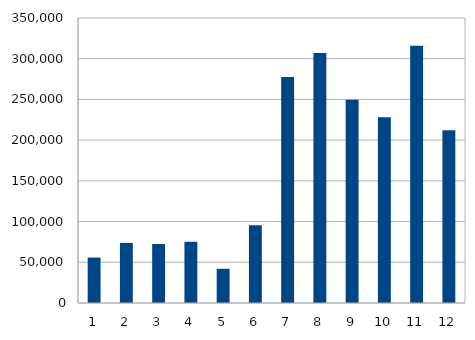
| Category | Series 0 |
|---|---|
| 0 | 55793 |
| 1 | 73816 |
| 2 | 72422 |
| 3 | 75182 |
| 4 | 42023 |
| 5 | 95630 |
| 6 | 277604 |
| 7 | 307108 |
| 8 | 249689 |
| 9 | 228219 |
| 10 | 316012 |
| 11 | 212152 |